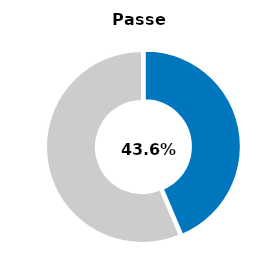
| Category | Series 0 |
|---|---|
| Passed | 0.436 |
| Other | 0.564 |